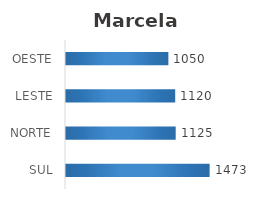
| Category | Series 0 |
|---|---|
| SUL | 1473 |
| NORTE | 1125 |
| LESTE | 1120 |
| OESTE | 1050 |